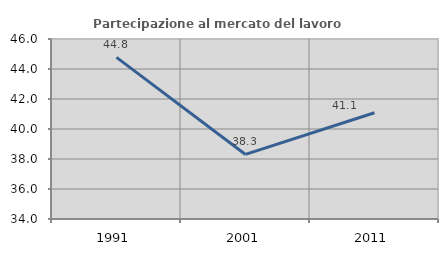
| Category | Partecipazione al mercato del lavoro  femminile |
|---|---|
| 1991.0 | 44.772 |
| 2001.0 | 38.304 |
| 2011.0 | 41.081 |